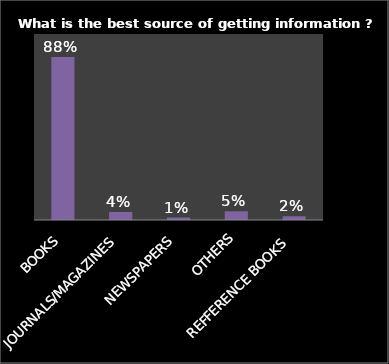
| Category | Series 0 |
|---|---|
| BOOKS | 0.877 |
| JOURNALS/MAGAZINES | 0.043 |
| NEWSPAPERS | 0.013 |
| OTHERS | 0.047 |
| REFFERENCE BOOKS | 0.02 |